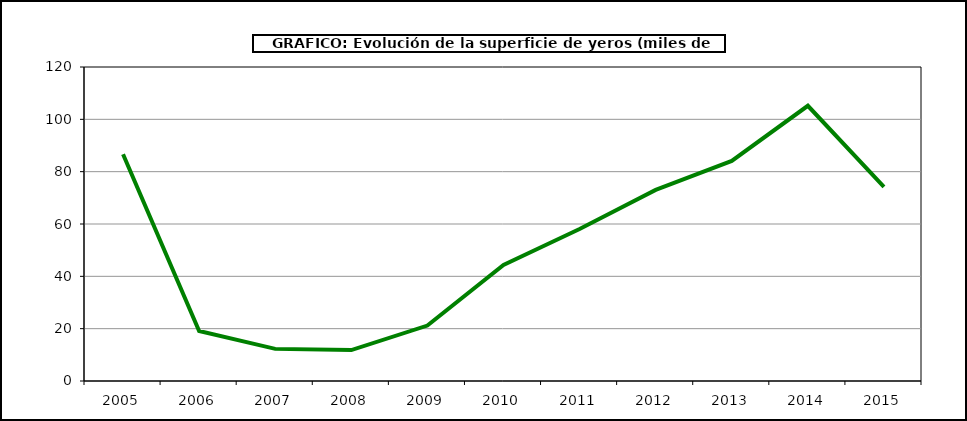
| Category | Superficie |
|---|---|
| 2005.0 | 86.685 |
| 2006.0 | 19.105 |
| 2007.0 | 12.276 |
| 2008.0 | 11.807 |
| 2009.0 | 21.198 |
| 2010.0 | 44.369 |
| 2011.0 | 58.104 |
| 2012.0 | 73.051 |
| 2013.0 | 84.103 |
| 2014.0 | 105.185 |
| 2015.0 | 74.162 |